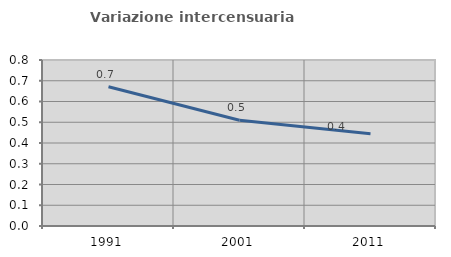
| Category | Variazione intercensuaria annua |
|---|---|
| 1991.0 | 0.671 |
| 2001.0 | 0.51 |
| 2011.0 | 0.444 |